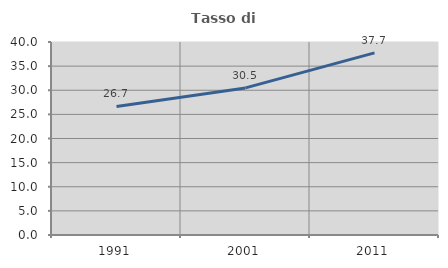
| Category | Tasso di occupazione   |
|---|---|
| 1991.0 | 26.652 |
| 2001.0 | 30.482 |
| 2011.0 | 37.744 |